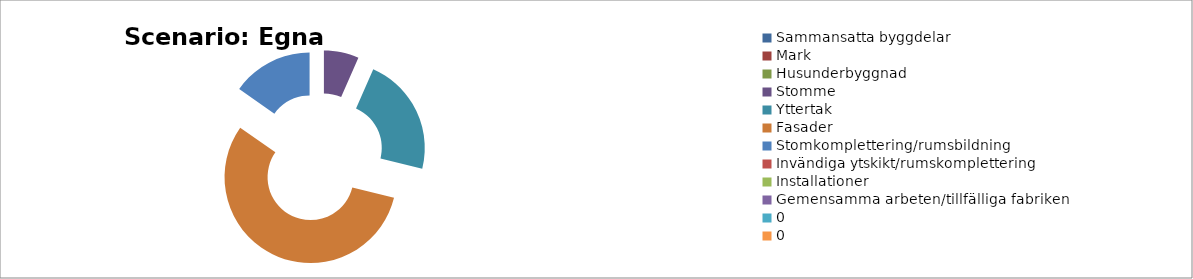
| Category | Scenario: Egna val |
|---|---|
| Sammansatta byggdelar | 0 |
| Mark | 0 |
| Husunderbyggnad | 0 |
| Stomme | 4.54 |
| Yttertak | 15.43 |
| Fasader | 38.62 |
| Stomkomplettering/rumsbildning | 10.55 |
| Invändiga ytskikt/rumskomplettering | 0 |
| Installationer | 0 |
| Gemensamma arbeten/tillfälliga fabriken | 0 |
| 0 | 0 |
| 0 | 0 |